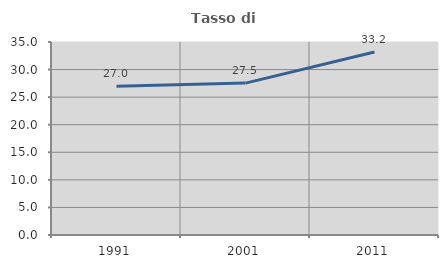
| Category | Tasso di occupazione   |
|---|---|
| 1991.0 | 26.968 |
| 2001.0 | 27.547 |
| 2011.0 | 33.185 |